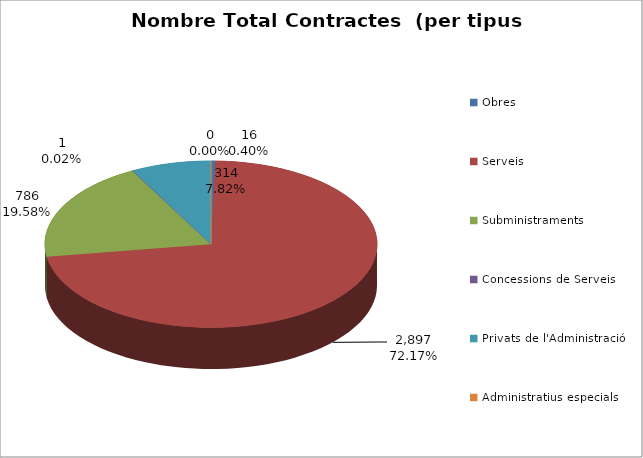
| Category | Nombre Total Contractes |
|---|---|
| Obres | 16 |
| Serveis | 2897 |
| Subministraments | 786 |
| Concessions de Serveis | 1 |
| Privats de l'Administració | 314 |
| Administratius especials | 0 |